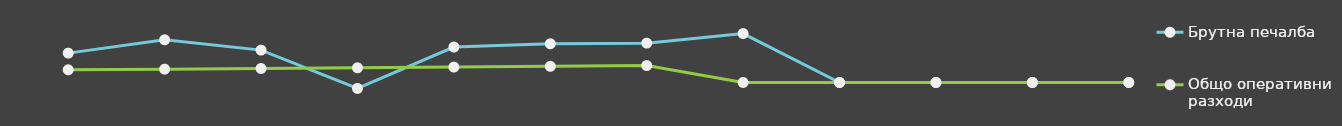
| Category | Брутна печалба | Общо оперативни разходи |
|---|---|---|
| 0 | 25000 | 10841 |
| 1 | 36348 | 11367.25 |
| 2 | 27562 | 11919.82 |
| 3 | -5059.5 | 12500.01 |
| 4 | 30153.18 | 13109.21 |
| 5 | 32964.45 | 13748.86 |
| 6 | 33502.87 | 14420.51 |
| 7 | 41646 | 0 |
| 8 | 0 | 0 |
| 9 | 0 | 0 |
| 10 | 0 | 0 |
| 11 | 0 | 0 |